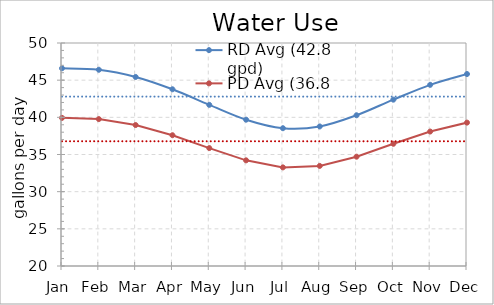
| Category | RD Avg (42.8 gpd) | PD Avg (36.8 gpd) | Series 2 | Series 3 |
|---|---|---|---|---|
| Jan | 46.597 | 39.928 | 42.79 | 36.782 |
| Feb | 46.4 | 39.765 | 42.79 | 36.782 |
| Mar | 45.431 | 38.964 | 42.79 | 36.782 |
| Apr | 43.772 | 37.594 | 42.79 | 36.782 |
| May | 41.68 | 35.864 | 42.79 | 36.782 |
| Jun | 39.684 | 34.215 | 42.79 | 36.782 |
| Jul | 38.537 | 33.268 | 42.79 | 36.782 |
| Aug | 38.773 | 33.463 | 42.79 | 36.782 |
| Sep | 40.278 | 34.706 | 42.79 | 36.782 |
| Oct | 42.378 | 36.441 | 42.79 | 36.782 |
| Nov | 44.372 | 38.089 | 42.79 | 36.782 |
| Dec | 45.826 | 39.29 | 42.79 | 36.782 |